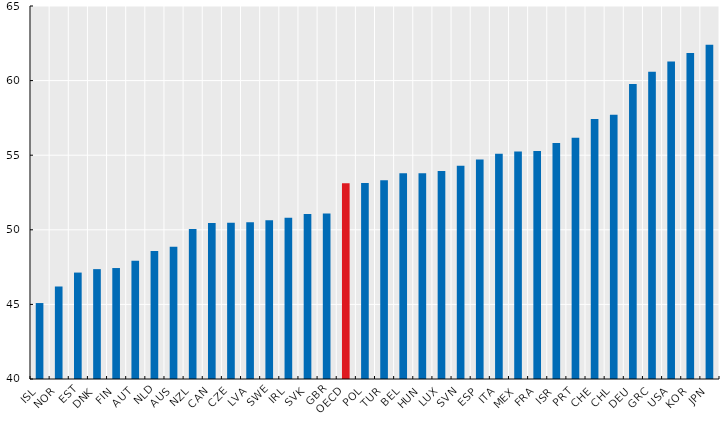
| Category | Average age of cabinet members |
|---|---|
| ISL | 45.091 |
| NOR | 46.2 |
| EST | 47.133 |
| DNK | 47.364 |
| FIN | 47.438 |
| AUT | 47.929 |
| NLD | 48.583 |
| AUS | 48.87 |
| NZL | 50.05 |
| CAN | 50.448 |
| CZE | 50.467 |
| LVA | 50.5 |
| SWE | 50.636 |
| IRL | 50.8 |
| SVK | 51.067 |
| GBR | 51.087 |
| OECD | 53.122 |
| POL | 53.136 |
| TUR | 53.321 |
| BEL | 53.786 |
| HUN | 53.786 |
| LUX | 53.944 |
| SVN | 54.294 |
| ESP | 54.714 |
| ITA | 55.105 |
| MEX | 55.25 |
| FRA | 55.278 |
| ISR | 55.818 |
| PRT | 56.167 |
| CHE | 57.429 |
| CHL | 57.708 |
| DEU | 59.769 |
| GRC | 60.591 |
| USA | 61.28 |
| KOR | 61.842 |
| JPN | 62.4 |